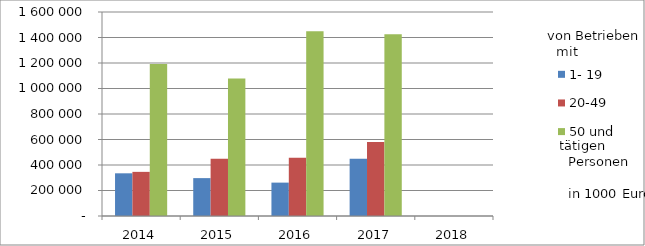
| Category | 1- 19 | 20-49 | 50 und mehr |
|---|---|---|---|
| 2014.0 | 334848.153 | 346160.396 | 1192631.258 |
| 2015.0 | 297116.655 | 448998.512 | 1078892.853 |
| 2016.0 | 261822.605 | 456254.347 | 1449929.516 |
| 2017.0 | 449238.155 | 579413.351 | 1425932.487 |
| 2018.0 | 0 | 0 | 0 |